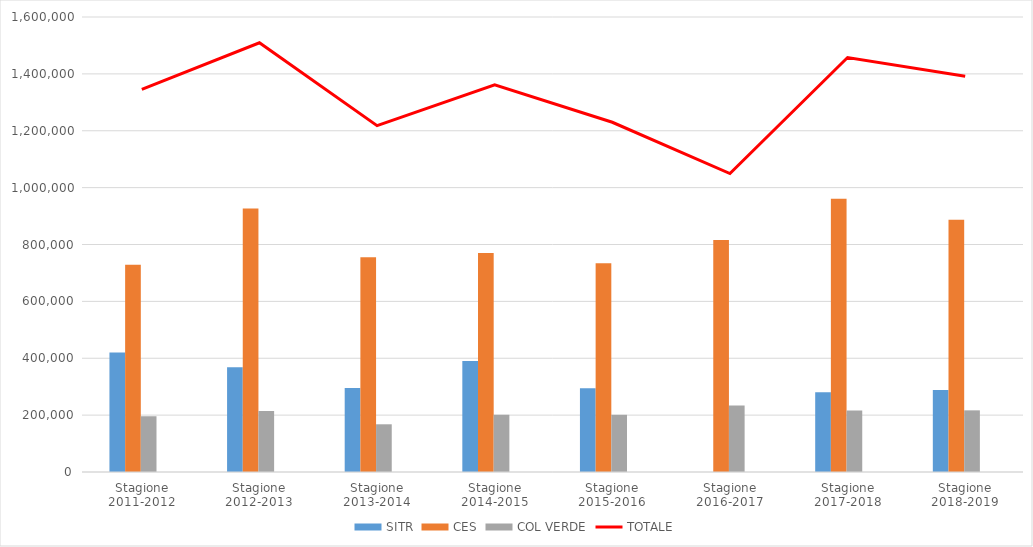
| Category | Series 5 | SITR | CES | COL VERDE | Series 3 | Series 6 |
|---|---|---|---|---|---|---|
| Stagione 2011-2012 |  | 420437 | 728988 | 195856 |  |  |
| Stagione 2012-2013 |  | 368203 | 926925 | 214355 |  |  |
| Stagione 2013-2014 |  | 295181 | 755125 | 167763 |  |  |
| Stagione 2014-2015 |  | 390477 | 770309 | 200958 |  |  |
| Stagione 2015-2016 |  | 294500 | 734189 | 201150 |  |  |
| Stagione 2016-2017 |  | 17 | 815909 | 233577 |  |  |
| Stagione 2017-2018 |  | 280577 | 960613 | 216394 |  |  |
| Stagione 2018-2019 |  | 288167 | 886629 | 216796 |  |  |